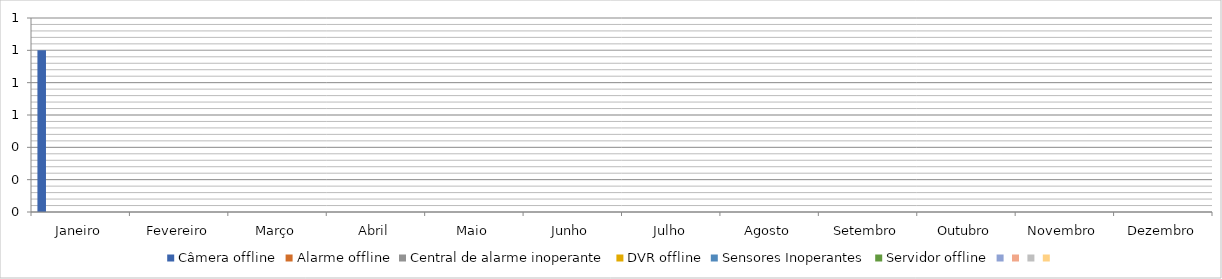
| Category | Câmera offline | Alarme offline | Central de alarme inoperante | DVR offline | Sensores Inoperantes | Servidor offline | Series 6 | Series 7 | Series 8 | Series 9 |
|---|---|---|---|---|---|---|---|---|---|---|
| Janeiro | 1 | 0 | 0 | 0 | 0 | 0 | 0 | 0 | 0 | 0 |
| Fevereiro | 0 | 0 | 0 | 0 | 0 | 0 | 0 | 0 | 0 | 0 |
| Março | 0 | 0 | 0 | 0 | 0 | 0 | 0 | 0 | 0 | 0 |
| Abril | 0 | 0 | 0 | 0 | 0 | 0 | 0 | 0 | 0 | 0 |
| Maio | 0 | 0 | 0 | 0 | 0 | 0 | 0 | 0 | 0 | 0 |
| Junho | 0 | 0 | 0 | 0 | 0 | 0 | 0 | 0 | 0 | 0 |
| Julho | 0 | 0 | 0 | 0 | 0 | 0 | 0 | 0 | 0 | 0 |
| Agosto | 0 | 0 | 0 | 0 | 0 | 0 | 0 | 0 | 0 | 0 |
| Setembro | 0 | 0 | 0 | 0 | 0 | 0 | 0 | 0 | 0 | 0 |
| Outubro | 0 | 0 | 0 | 0 | 0 | 0 | 0 | 0 | 0 | 0 |
| Novembro | 0 | 0 | 0 | 0 | 0 | 0 | 0 | 0 | 0 | 0 |
| Dezembro | 0 | 0 | 0 | 0 | 0 | 0 | 0 | 0 | 0 | 0 |